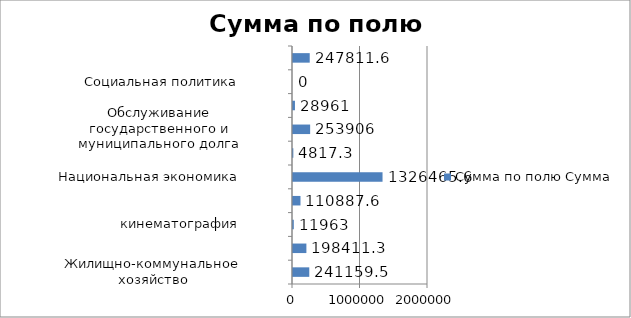
| Category | Итог |
|---|---|
| Жилищно-коммунальное хозяйство | 241159.5 |
| Культура, кинематография | 198411.3 |
| Национальная безопасность и правоохранительная деятельность | 11963 |
| Национальная экономика | 110887.6 |
| Образование | 1326465.6 |
| Обслуживание государственного и муниципального долга | 4817.3 |
| Общегосударственные расходы | 253906 |
| Социальная политика | 28961 |
| Условно утвержденные расходы | 0 |
| Физическая культура и спорт | 247811.6 |